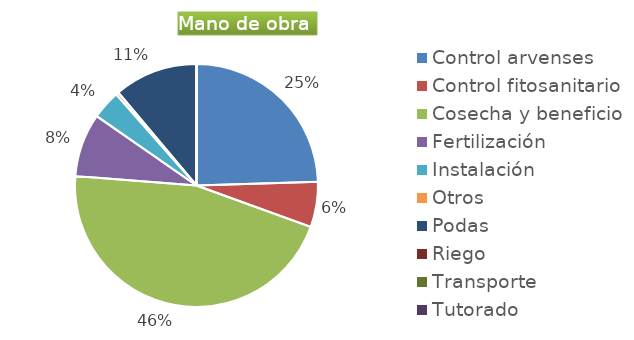
| Category | Series 0 |
|---|---|
| Control arvenses | 9314309 |
| Control fitosanitario | 2285720 |
| Cosecha y beneficio | 17371472 |
| Fertilización | 3200008 |
| Instalación | 1457146.5 |
| Otros | 142857.5 |
| Podas | 4228582 |
| Riego | 0 |
| Transporte | 0 |
| Tutorado | 0 |